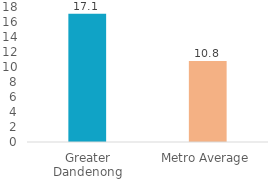
| Category | Series 0 |
|---|---|
| Greater Dandenong | 17.083 |
| Metro Average | 10.787 |